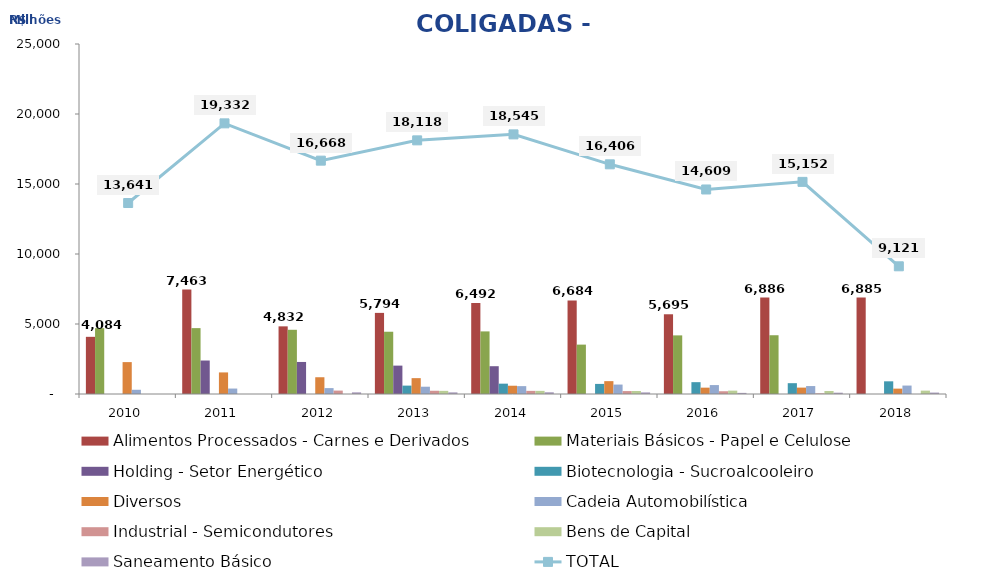
| Category | Alimentos Processados - Carnes e Derivados | Materiais Básicos - Papel e Celulose | Holding - Setor Energético | Biotecnologia - Sucroalcooleiro | Diversos | Cadeia Automobilística | Industrial - Semicondutores | Bens de Capital | Saneamento Básico |
|---|---|---|---|---|---|---|---|---|---|
| 2010.0 | 4083.577 | 4703.324 | 0 | 0 | 2277.835 | 301.467 | 0 | 0 | 0 |
| 2011.0 | 7463.127 | 4705.596 | 2391.431 | 0 | 1541.531 | 389.57 | 0 | 0 | 0 |
| 2012.0 | 4831.774 | 4587.273 | 2288.65 | 0 | 1196.779 | 420.863 | 244.034 | 0 | 120 |
| 2013.0 | 5794.037 | 4447.533 | 2027.449 | 598.984 | 1132.553 | 520.474 | 231.993 | 225.156 | 118.363 |
| 2014.0 | 6492.057 | 4471.081 | 1985.961 | 738.387 | 591.282 | 561.874 | 224.346 | 223.553 | 124.743 |
| 2015.0 | 6683.574 | 3527.663 | 0 | 720.948 | 918.585 | 673.538 | 209.092 | 214.365 | 115.718 |
| 2016.0 | 5695.291 | 4186.573 | 0 | 845.261 | 453.261 | 637.269 | 196.752 | 240.41 | 80.406 |
| 2017.0 | 6886.053 | 4196.966 | 0 | 772.899 | 457.015 | 567.433 | 45.626 | 215.121 | 94.348 |
| 2018.0 | 6884.919 | 0 | 0 | 905.668 | 383.731 | 602.386 | 0 | 241.542 | 103.195 |